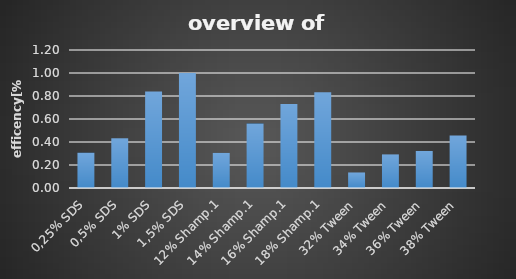
| Category | Series 0 |
|---|---|
| 0,25% SDS | 0.307 |
| 0,5% SDS | 0.432 |
| 1% SDS | 0.84 |
| 1,5% SDS | 1 |
| 12% Shamp.1 | 0.305 |
| 14% Shamp.1 | 0.56 |
| 16% Shamp.1 | 0.731 |
| 18% Shamp.1 | 0.833 |
| 32% Tween | 0.135 |
| 34% Tween | 0.292 |
| 36% Tween | 0.322 |
| 38% Tween | 0.457 |